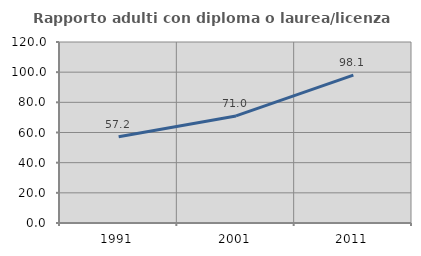
| Category | Rapporto adulti con diploma o laurea/licenza media  |
|---|---|
| 1991.0 | 57.2 |
| 2001.0 | 70.988 |
| 2011.0 | 98.088 |